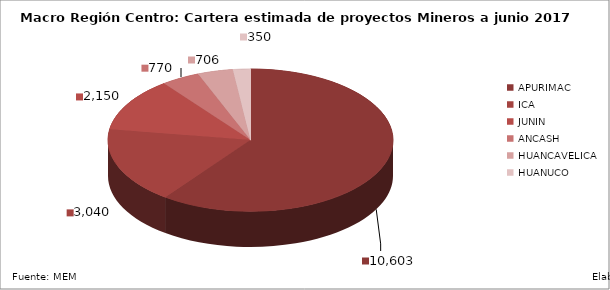
| Category | Series 0 |
|---|---|
| APURIMAC | 10603 |
| ICA | 3040 |
| JUNIN | 2150 |
| ANCASH | 770 |
| HUANCAVELICA | 706 |
| HUANUCO | 350 |